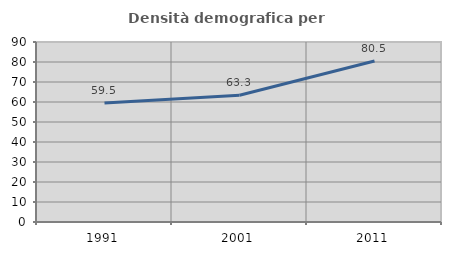
| Category | Densità demografica |
|---|---|
| 1991.0 | 59.519 |
| 2001.0 | 63.339 |
| 2011.0 | 80.484 |